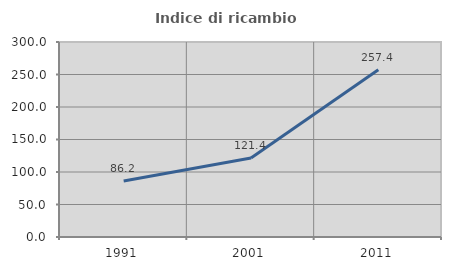
| Category | Indice di ricambio occupazionale  |
|---|---|
| 1991.0 | 86.239 |
| 2001.0 | 121.386 |
| 2011.0 | 257.386 |